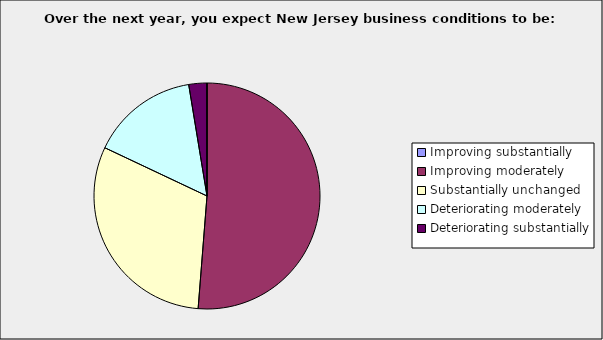
| Category | Series 0 |
|---|---|
| Improving substantially | 0 |
| Improving moderately | 0.513 |
| Substantially unchanged | 0.308 |
| Deteriorating moderately | 0.154 |
| Deteriorating substantially | 0.026 |